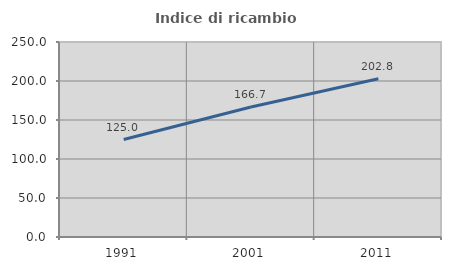
| Category | Indice di ricambio occupazionale  |
|---|---|
| 1991.0 | 125 |
| 2001.0 | 166.667 |
| 2011.0 | 202.778 |